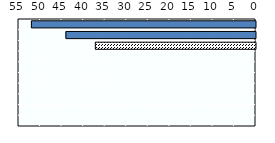
| Category | Length in weeks |
|---|---|
| Korea | 52 |
| Japan | 44 |
| OECD average (d) | 37.171 |
| Australia | 0 |
| China | 0 |
| Hong Kong (China) | 0 |
| New Zealand | 0 |
| Singapore | 0 |
| Thailand | 0 |
| Viet Nam | 0 |